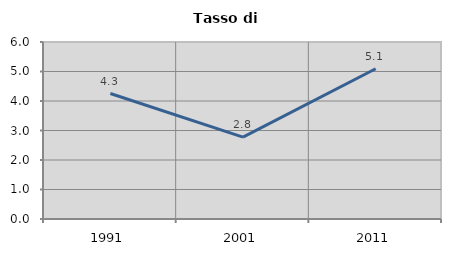
| Category | Tasso di disoccupazione   |
|---|---|
| 1991.0 | 4.253 |
| 2001.0 | 2.778 |
| 2011.0 | 5.092 |